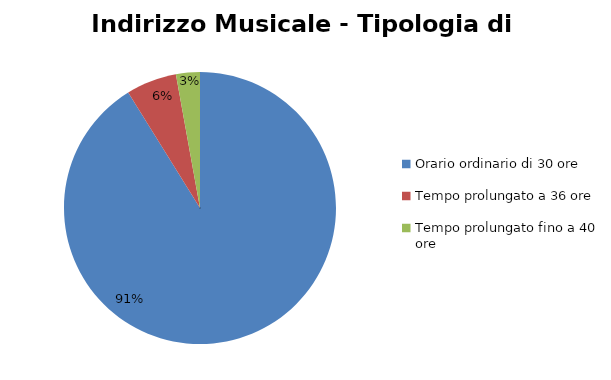
| Category | Series 0 | Series 1 |
|---|---|---|
| Orario ordinario di 30 ore | 2440 |  |
| Tempo prolungato a 36 ore | 161 |  |
| Tempo prolungato fino a 40 ore | 76 |  |